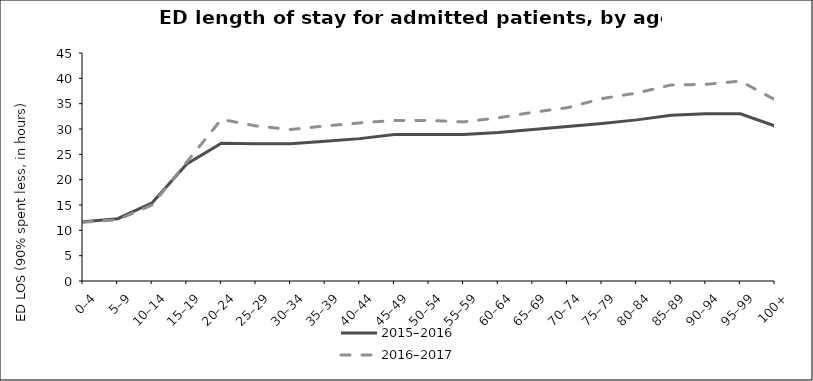
| Category | 2015–2016 | 2016–2017 |
|---|---|---|
| 0–4 | 11.7 | 11.6 |
| 5–9 | 12.3 | 12.1 |
| 10–14 | 15.43 | 15 |
| 15–19 | 23.1 | 23.5 |
| 20–24 | 27.2 | 31.9 |
| 25–29 | 27.1 | 30.6 |
| 30–34 | 27.1 | 29.9 |
| 35–39 | 27.6 | 30.6 |
| 40–44 | 28.1 | 31.2 |
| 45–49 | 28.9 | 31.7 |
| 50–54 | 28.9 | 31.7 |
| 55–59 | 28.9 | 31.4 |
| 60–64 | 29.3 | 32.2 |
| 65–69 | 29.9 | 33.3 |
| 70–74 | 30.5 | 34.2 |
| 75–79 | 31.1 | 36 |
| 80–84 | 31.8 | 37.1 |
| 85–89 | 32.7 | 38.7 |
| 90–94 | 33 | 38.8 |
| 95–99 | 33 | 39.46 |
| 100+ | 30.6 | 35.77 |